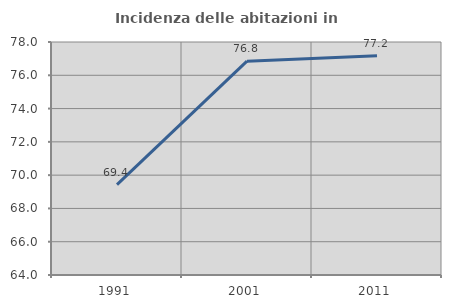
| Category | Incidenza delle abitazioni in proprietà  |
|---|---|
| 1991.0 | 69.428 |
| 2001.0 | 76.847 |
| 2011.0 | 77.177 |